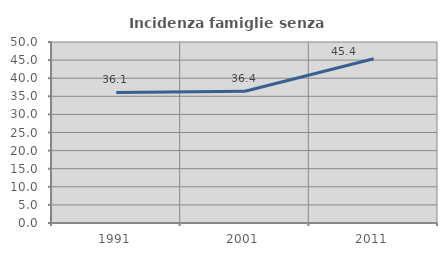
| Category | Incidenza famiglie senza nuclei |
|---|---|
| 1991.0 | 36.08 |
| 2001.0 | 36.384 |
| 2011.0 | 45.361 |